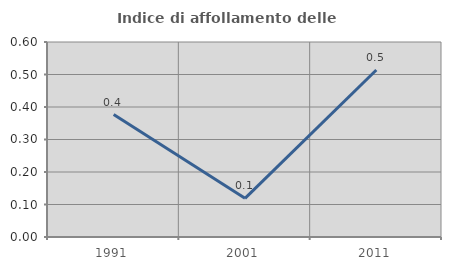
| Category | Indice di affollamento delle abitazioni  |
|---|---|
| 1991.0 | 0.377 |
| 2001.0 | 0.119 |
| 2011.0 | 0.514 |